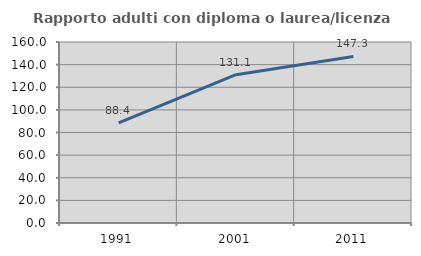
| Category | Rapporto adulti con diploma o laurea/licenza media  |
|---|---|
| 1991.0 | 88.45 |
| 2001.0 | 131.135 |
| 2011.0 | 147.268 |